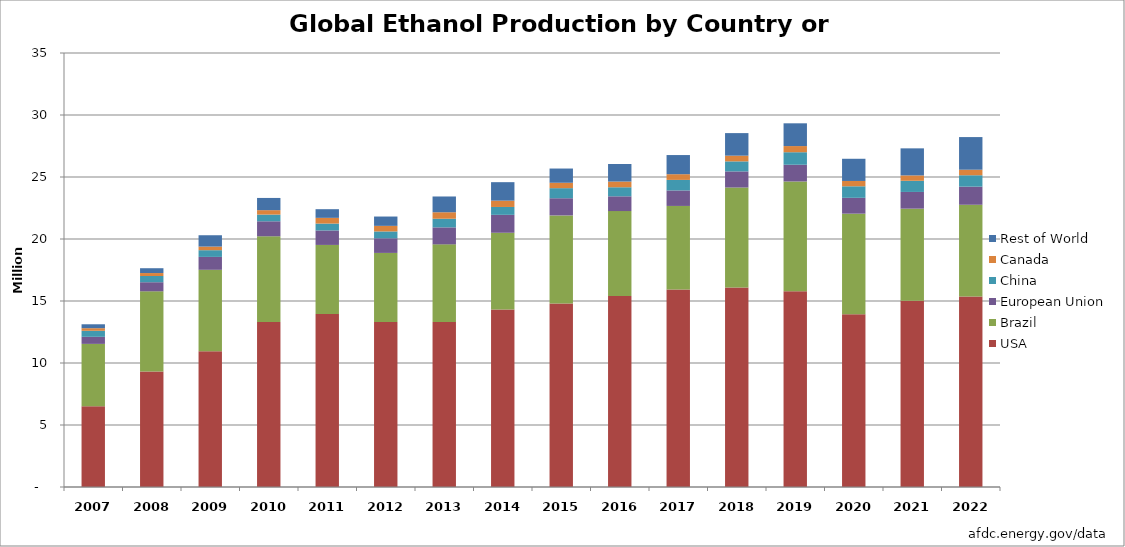
| Category | USA | Brazil | European Union | China | Canada | Rest of World |
|---|---|---|---|---|---|---|
| 2007.0 | 6521 | 5019.2 | 570.3 | 486 | 211.3 | 315.3 |
| 2008.0 | 9309 | 6472.2 | 733.6 | 501.9 | 237.7 | 389.4 |
| 2009.0 | 10938 | 6578 | 1040 | 542 | 291 | 914 |
| 2010.0 | 13298 | 6921.54 | 1208.58 | 541.55 | 356.63 | 984.61 |
| 2011.0 | 13948 | 5573.24 | 1167.64 | 554.76 | 462.3 | 698.15 |
| 2012.0 | 13300 | 5577 | 1179 | 555 | 449 | 752 |
| 2013.0 | 13300 | 6267 | 1371 | 696 | 523 | 1272 |
| 2014.0 | 14313 | 6190 | 1445 | 635 | 510 | 1490 |
| 2015.0 | 14807 | 7093 | 1387 | 813 | 436 | 1147 |
| 2016.0 | 15413 | 6840 | 1190 | 730 | 460 | 1417 |
| 2017.0 | 15936 | 6730 | 1250 | 850 | 460 | 1544 |
| 2018.0 | 16091 | 8060 | 1300 | 810 | 460 | 1819 |
| 2019.0 | 15778 | 8860 | 1350 | 1010 | 497 | 1835 |
| 2020.0 | 13941 | 8100 | 1280 | 930 | 429 | 1790 |
| 2021.0 | 15015 | 7430 | 1350 | 900 | 434 | 2181 |
| 2022.0 | 15361 | 7400 | 1460 | 920 | 447 | 2632 |